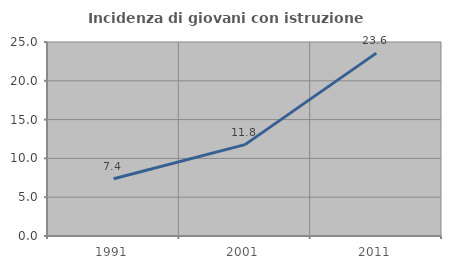
| Category | Incidenza di giovani con istruzione universitaria |
|---|---|
| 1991.0 | 7.372 |
| 2001.0 | 11.773 |
| 2011.0 | 23.567 |